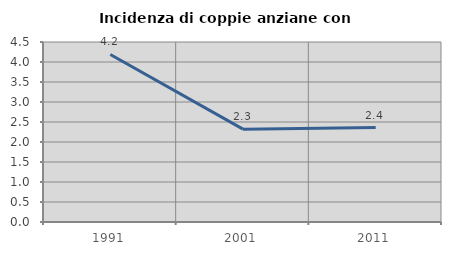
| Category | Incidenza di coppie anziane con figli |
|---|---|
| 1991.0 | 4.188 |
| 2001.0 | 2.321 |
| 2011.0 | 2.361 |